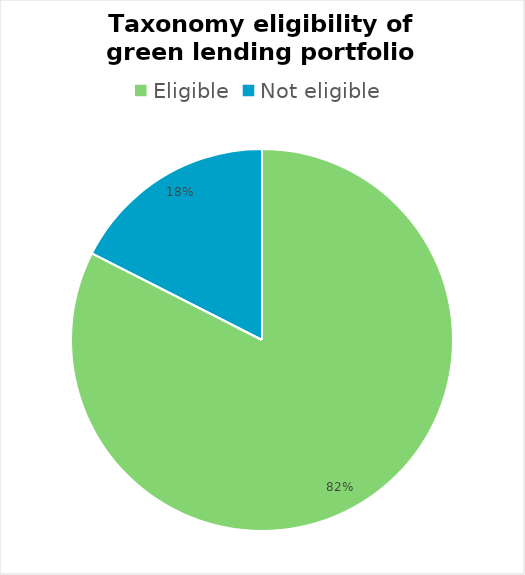
| Category | Series 0 |
|---|---|
| Eligible  | 0.825 |
| Not eligible | 0.175 |